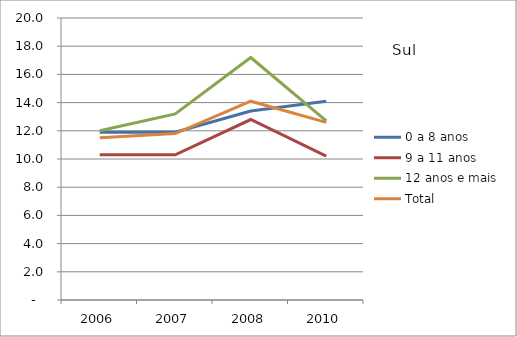
| Category | 0 a 8 anos | 9 a 11 anos | 12 anos e mais | Total |
|---|---|---|---|---|
| 2006.0 | 11.9 | 10.3 | 12 | 11.5 |
| 2007.0 | 11.9 | 10.3 | 13.2 | 11.8 |
| 2008.0 | 13.4 | 12.8 | 17.2 | 14.1 |
| 2010.0 | 14.1 | 10.2 | 12.7 | 12.6 |